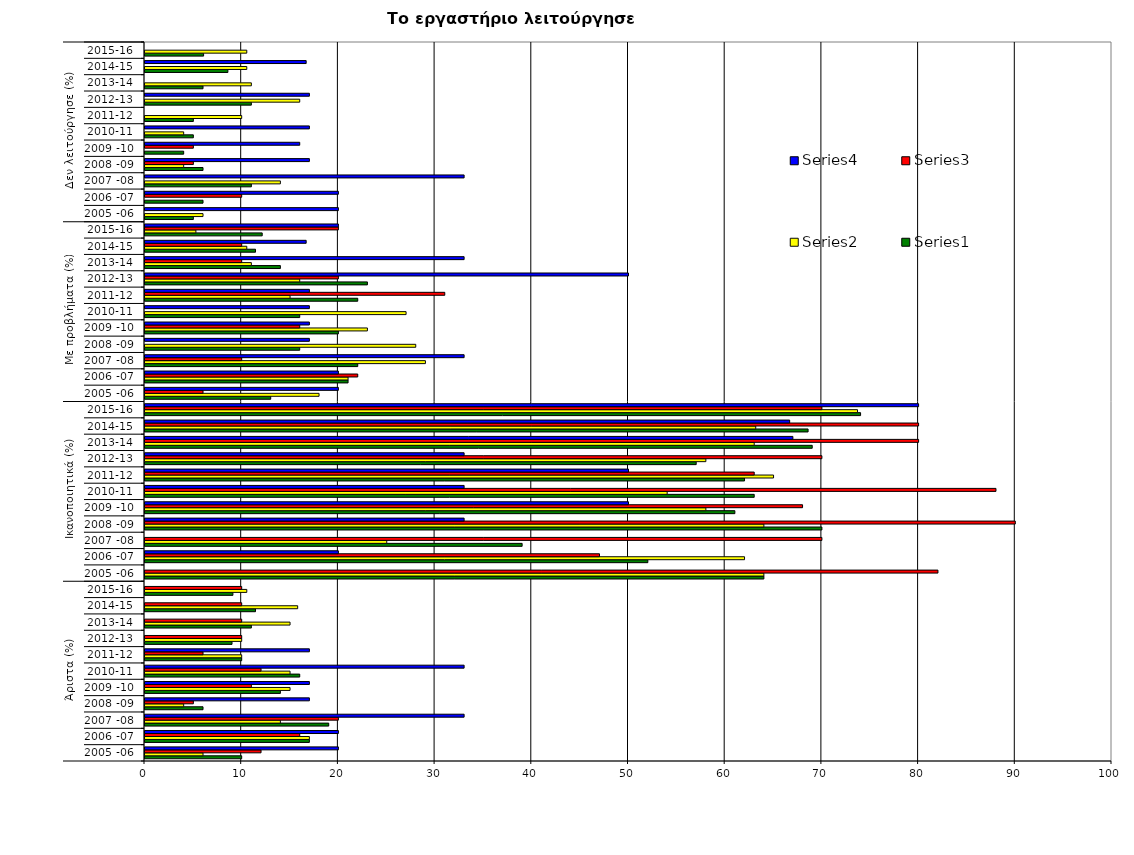
| Category | Series 0 | Series 1 | Series 2 | Series 3 |
|---|---|---|---|---|
| 0 | 10 | 6 | 12 | 20 |
| 1 | 17 | 17 | 16 | 20 |
| 2 | 19 | 14 | 20 | 33 |
| 3 | 6 | 4 | 5 | 17 |
| 4 | 14 | 15 | 11 | 17 |
| 5 | 16 | 15 | 12 | 33 |
| 6 | 10 | 10 | 6 | 17 |
| 7 | 9 | 10 | 10 | 0 |
| 8 | 11 | 15 | 10 | 0 |
| 9 | 11.429 | 15.789 | 10 | 0 |
| 10 | 9.091 | 10.526 | 10 | 0 |
| 11 | 64 | 64 | 82 | 0 |
| 12 | 52 | 62 | 47 | 20 |
| 13 | 39 | 25 | 70 | 0 |
| 14 | 70 | 64 | 90 | 33 |
| 15 | 61 | 58 | 68 | 50 |
| 16 | 63 | 54 | 88 | 33 |
| 17 | 62 | 65 | 63 | 50 |
| 18 | 57 | 58 | 70 | 33 |
| 19 | 69 | 63 | 80 | 67 |
| 20 | 68.571 | 63.158 | 80 | 66.667 |
| 21 | 74 | 73.684 | 70 | 80 |
| 22 | 13 | 18 | 6 | 20 |
| 23 | 21 | 21 | 22 | 20 |
| 24 | 22 | 29 | 10 | 33 |
| 25 | 16 | 28 | 0 | 17 |
| 26 | 20 | 23 | 16 | 17 |
| 27 | 16 | 27 | 0 | 17 |
| 28 | 22 | 15 | 31 | 17 |
| 29 | 23 | 16 | 20 | 50 |
| 30 | 14 | 11 | 10 | 33 |
| 31 | 11.429 | 10.526 | 10 | 16.667 |
| 32 | 12.121 | 5.263 | 20 | 20 |
| 33 | 5 | 6 | 0 | 20 |
| 34 | 6 | 0 | 10 | 20 |
| 35 | 11 | 14 | 0 | 33 |
| 36 | 6 | 4 | 5 | 17 |
| 37 | 4 | 0 | 5 | 16 |
| 38 | 5 | 4 | 0 | 17 |
| 39 | 5 | 10 | 0 | 0 |
| 40 | 11 | 16 | 0 | 17 |
| 41 | 6 | 11 | 0 | 0 |
| 42 | 8.571 | 10.526 | 0 | 16.667 |
| 43 | 6.061 | 10.526 | 0 | 0 |